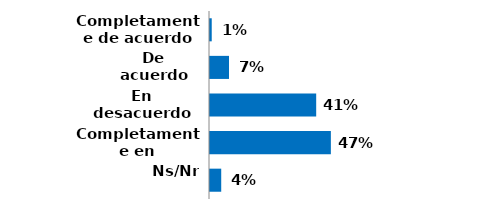
| Category | Series 0 |
|---|---|
| Completamente de acuerdo | 0.007 |
| De acuerdo | 0.073 |
| En desacuerdo | 0.41 |
| Completamente en desacuerdo | 0.467 |
| Ns/Nr | 0.043 |